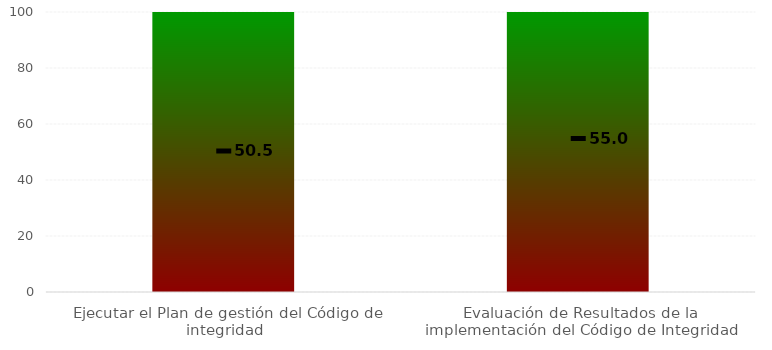
| Category | Niveles |
|---|---|
| Ejecutar el Plan de gestión del Código de integridad | 100 |
| Evaluación de Resultados de la implementación del Código de Integridad | 100 |